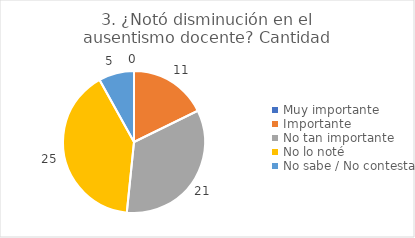
| Category | 3. ¿Notó disminución en el ausentismo docente? |
|---|---|
| Muy importante  | 0 |
| Importante  | 0.177 |
| No tan importante  | 0.339 |
| No lo noté  | 0.403 |
| No sabe / No contesta | 0.081 |